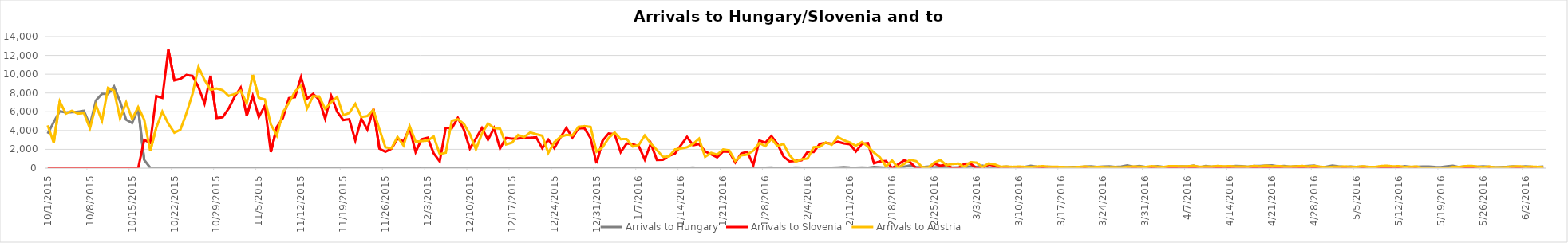
| Category | Arrivals to Hungary | Arrivals to Slovenia | Arrivals to Austria |
|---|---|---|---|
| 10/1/15 | 3667 | 0 | 4550 |
| 10/2/15 | 4897 | 0 | 2700 |
| 10/3/15 | 6056 | 0 | 7100 |
| 10/4/15 | 5925 | 0 | 5800 |
| 10/5/15 | 5952 | 0 | 6100 |
| 10/6/15 | 6000 | 0 | 5800 |
| 10/7/15 | 6103 | 0 | 5861 |
| 10/8/15 | 4583 | 6 | 4229 |
| 10/9/15 | 7215 | 0 | 6700 |
| 10/10/15 | 7907 | 0 | 5050 |
| 10/11/15 | 7897 | 0 | 8540 |
| 10/12/15 | 8702 | 0 | 8240 |
| 10/13/15 | 7081 | 0 | 5280 |
| 10/14/15 | 5157 | 0 | 7000 |
| 10/15/15 | 4808 | 0 | 5235 |
| 10/16/15 | 6353 | 0 | 6500 |
| 10/17/15 | 870 | 3000 | 5155 |
| 10/18/15 | 41 | 2700 | 1822 |
| 10/19/15 | 22 | 7677 | 4300 |
| 10/20/15 | 36 | 7478 | 6017 |
| 10/21/15 | 39 | 12616 | 4737 |
| 10/22/15 | 32 | 9339 | 3767 |
| 10/23/15 | 29 | 9500 | 4092 |
| 10/24/15 | 35 | 9925 | 5841 |
| 10/25/15 | 34 | 9818 | 7882 |
| 10/26/15 | 12 | 8625 | 10784 |
| 10/27/15 | 7 | 6877 | 9390 |
| 10/28/15 | 4 | 9848 | 8336 |
| 10/29/15 | 23 | 5341 | 8473 |
| 10/30/15 | 18 | 5409 | 8302 |
| 10/31/15 | 10 | 6344 | 7691 |
| 11/1/15 | 14 | 7611 | 7887 |
| 11/2/15 | 31 | 8568 | 8243 |
| 11/3/15 | 8 | 5591 | 6900 |
| 11/4/15 | 10 | 7693 | 9930 |
| 11/5/15 | 18 | 5426 | 7478 |
| 11/6/15 | 4 | 6655 | 7315 |
| 11/7/15 | 8 | 1716 | 4648 |
| 11/8/15 | 9 | 4381 | 3465 |
| 11/9/15 | 25 | 5341 | 5962 |
| 11/10/15 | 14 | 7457 | 6933 |
| 11/11/15 | 13 | 7554 | 8169 |
| 11/12/15 | 23 | 9681 | 8777 |
| 11/13/15 | 6 | 7397 | 6351 |
| 11/14/15 | 21 | 7905 | 7659 |
| 11/15/15 | 8 | 7300 | 7632 |
| 11/16/15 | 15 | 5261 | 6319 |
| 11/17/15 | 5 | 7704 | 7026 |
| 11/18/15 | 15 | 5998 | 7577 |
| 11/19/15 | 4 | 5119 | 5635 |
| 11/20/15 | 9 | 5211 | 5865 |
| 11/21/15 | 2 | 2952 | 6836 |
| 11/22/15 | 11 | 5260 | 5446 |
| 11/23/15 | 4 | 4102 | 5546 |
| 11/24/15 | 4 | 6297 | 6204 |
| 11/25/15 | 6 | 2070 | 4122 |
| 11/26/15 | 10 | 1742 | 2211 |
| 11/27/15 | 2 | 2065 | 2120 |
| 11/28/15 | 6 | 3139 | 3320 |
| 11/29/15 | 3 | 2843 | 2407 |
| 11/30/15 | 7 | 4274 | 4482 |
| 12/1/15 | 4 | 1709 | 2821 |
| 12/2/15 | 4 | 3077 | 2874 |
| 12/3/15 | 9 | 3237 | 2935 |
| 12/4/15 | 1 | 1577 | 3366 |
| 12/5/15 | 31 | 715 | 1493 |
| 12/6/15 | 7 | 4288 | 1643 |
| 12/7/15 | 0 | 4240 | 5035 |
| 12/8/15 | 13 | 5351 | 5210 |
| 12/9/15 | 14 | 4103 | 4714 |
| 12/10/15 | 3 | 2078 | 3623 |
| 12/11/15 | 0 | 3149 | 2000 |
| 12/12/15 | 13 | 4271 | 3675 |
| 12/13/15 | 10 | 3016 | 4754 |
| 12/14/15 | 3 | 4250 | 4263 |
| 12/15/15 | 2 | 2098 | 4193 |
| 12/16/15 | 6 | 3214 | 2519 |
| 12/17/15 | 0 | 3135 | 2717 |
| 12/18/15 | 11 | 3150 | 3532 |
| 12/19/15 | 31 | 3222 | 3305 |
| 12/20/15 | 8 | 3233 | 3800 |
| 12/21/15 | 25 | 3278 | 3611 |
| 12/22/15 | 1 | 2118 | 3451 |
| 12/23/15 | 21 | 3030 | 1613 |
| 12/24/15 | 8 | 2131 | 2764 |
| 12/25/15 | 2 | 3257 | 3321 |
| 12/26/15 | 17 | 4274 | 3532 |
| 12/27/15 | 10 | 3253 | 3476 |
| 12/28/15 | 0 | 4228 | 4394 |
| 12/29/15 | 0 | 4239 | 4468 |
| 12/30/15 | 11 | 3195 | 4386 |
| 12/31/15 | 5 | 511 | 1756 |
| 1/1/16 | 0 | 2914 | 2226 |
| 1/2/16 | 0 | 3690 | 3199 |
| 1/3/16 | 17 | 3619 | 3793 |
| 1/4/16 | 3 | 1708 | 3085 |
| 1/5/16 | 18 | 2626 | 3091 |
| 1/6/16 | 5 | 2550 | 2299 |
| 1/7/16 | 31 | 2337 | 2466 |
| 1/8/16 | 7 | 916 | 3472 |
| 1/9/16 | 15 | 2630 | 2619 |
| 1/10/16 | 6 | 880 | 1934 |
| 1/11/16 | 7 | 897 | 1204 |
| 1/12/16 | 2 | 1308 | 1231 |
| 1/13/16 | 5 | 1544 | 1991 |
| 1/14/16 | 4 | 2449 | 2082 |
| 1/15/16 | 14 | 3330 | 2219 |
| 1/16/16 | 65 | 2435 | 2578 |
| 1/17/16 | 11 | 2570 | 3141 |
| 1/18/16 | 9 | 1783 | 1203 |
| 1/19/16 | 29 | 1476 | 1630 |
| 1/20/16 | 10 | 1154 | 1439 |
| 1/21/16 | 13 | 1787 | 1989 |
| 1/22/16 | 47 | 1738 | 1885 |
| 1/23/16 | 10 | 606 | 777 |
| 1/24/16 | 15 | 1564 | 1366 |
| 1/25/16 | 5 | 1746 | 1450 |
| 1/26/16 | 4 | 326 | 1867 |
| 1/27/16 | 36 | 2935 | 2670 |
| 1/28/16 | 51 | 2719 | 2340 |
| 1/29/16 | 69 | 3416 | 3121 |
| 1/30/16 | 6 | 2556 | 2351 |
| 1/31/16 | 39 | 1249 | 2579 |
| 2/1/16 | 31 | 716 | 1367 |
| 2/2/16 | 69 | 765 | 690 |
| 2/3/16 | 46 | 841 | 937 |
| 2/4/16 | 31 | 1733 | 1026 |
| 2/5/16 | 19 | 1713 | 2235 |
| 2/6/16 | 49 | 2580 | 2252 |
| 2/7/16 | 53 | 2694 | 2737 |
| 2/8/16 | 48 | 2582 | 2490 |
| 2/9/16 | 72 | 2805 | 3314 |
| 2/10/16 | 104 | 2637 | 2968 |
| 2/11/16 | 54 | 2547 | 2731 |
| 2/12/16 | 39 | 1774 | 2378 |
| 2/13/16 | 66 | 2576 | 2781 |
| 2/14/16 | 51 | 2660 | 2301 |
| 2/15/16 | 119 | 516 | 1651 |
| 2/16/16 | 93 | 715 | 1143 |
| 2/17/16 | 34 | 769 | 181 |
| 2/18/16 | 73 | 0 | 817 |
| 2/19/16 | 113 | 407 | 50 |
| 2/20/16 | 151 | 828 | 453 |
| 2/21/16 | 288 | 623 | 899 |
| 2/22/16 | 103 | 0 | 744 |
| 2/23/16 | 112 | 0 | 111 |
| 2/24/16 | 166 | 0 | 75 |
| 2/25/16 | 76 | 478 | 583 |
| 2/26/16 | 140 | 254 | 874 |
| 2/27/16 | 111 | 382 | 321 |
| 2/28/16 | 62 | 0 | 447 |
| 2/29/16 | 78 | 0 | 487 |
| 3/1/16 | 83 | 466 | 118 |
| 3/2/16 | 181 | 479 | 644 |
| 3/3/16 | 133 | 0 | 588 |
| 3/4/16 | 268 | 0 | 114 |
| 3/5/16 | 89 | 409 | 500 |
| 3/6/16 | 72 | 253 | 402 |
| 3/7/16 | 100 | 0 | 153 |
| 3/8/16 | 167 | 0 | 171 |
| 3/9/16 | 73 | 0 | 134 |
| 3/10/16 | 70 | 0 | 172 |
| 3/11/16 | 133 | 0 | 132 |
| 3/12/16 | 245 | 0 | 116 |
| 3/13/16 | 148 | 0 | 171 |
| 3/14/16 | 123 | 0 | 211 |
| 3/15/16 | 153 | 0 | 147 |
| 3/16/16 | 104 | 0 | 150 |
| 3/17/16 | 102 | 0 | 129 |
| 3/18/16 | 95 | 0 | 107 |
| 3/19/16 | 132 | 0 | 109 |
| 3/20/16 | 107 | 0 | 126 |
| 3/21/16 | 176 | 0 | 177 |
| 3/22/16 | 188 | 0 | 103 |
| 3/23/16 | 137 | 0 | 127 |
| 3/24/16 | 171 | 0 | 121 |
| 3/25/16 | 199 | 0 | 94 |
| 3/26/16 | 125 | 0 | 104 |
| 3/27/16 | 171 | 6 | 78 |
| 3/28/16 | 293 | 0 | 144 |
| 3/29/16 | 154 | 5 | 170 |
| 3/30/16 | 234 | 4 | 152 |
| 3/31/16 | 127 | 0 | 120 |
| 4/1/16 | 142 | 0 | 210 |
| 4/2/16 | 217 | 0 | 156 |
| 4/3/16 | 119 | 0 | 122 |
| 4/4/16 | 99 | 0 | 221 |
| 4/5/16 | 176 | 2 | 203 |
| 4/6/16 | 191 | 0 | 198 |
| 4/7/16 | 178 | 0 | 196 |
| 4/8/16 | 280 | 0 | 254 |
| 4/9/16 | 83 | 0 | 138 |
| 4/10/16 | 230 | 0 | 171 |
| 4/11/16 | 149 | 0 | 171 |
| 4/12/16 | 214 | 0 | 232 |
| 4/13/16 | 150 | 0 | 193 |
| 4/14/16 | 161 | 0 | 209 |
| 4/15/16 | 237 | 0 | 176 |
| 4/16/16 | 210 | 0 | 175 |
| 4/17/16 | 144 | 0 | 148 |
| 4/18/16 | 229 | 0 | 231 |
| 4/19/16 | 235 | 0 | 183 |
| 4/20/16 | 274 | 0 | 268 |
| 4/21/16 | 294 | 0 | 195 |
| 4/22/16 | 195 | 0 | 227 |
| 4/23/16 | 226 | 0 | 174 |
| 4/24/16 | 151 | 0 | 175 |
| 4/25/16 | 202 | 0 | 191 |
| 4/26/16 | 190 | 0 | 230 |
| 4/27/16 | 241 | 0 | 172 |
| 4/28/16 | 284 | 0 | 232 |
| 4/29/16 | 108 | 0 | 151 |
| 4/30/16 | 141 | 0 | 102 |
| 5/1/16 | 274 | 0 | 136 |
| 5/2/16 | 187 | 0 | 150 |
| 5/3/16 | 131 | 0 | 173 |
| 5/4/16 | 169 | 0 | 141 |
| 5/5/16 | 133 | 0 | 128 |
| 5/6/16 | 178 | 0 | 201 |
| 5/7/16 | 132 | 0 | 129 |
| 5/8/16 | 75 | 0 | 121 |
| 5/9/16 | 124 | 0 | 218 |
| 5/10/16 | 128 | 0 | 260 |
| 5/11/16 | 120 | 0 | 191 |
| 5/12/16 | 89 | 0 | 210 |
| 5/13/16 | 201 | 0 | 120 |
| 5/14/16 | 120 | 0 | 150 |
| 5/15/16 | 139 | 0 | 169 |
| 5/16/16 | 169 | 0 | 0 |
| 5/17/16 | 164 | 0 | 0 |
| 5/18/16 | 121 | 0 | 0 |
| 5/19/16 | 100 | 0 | 0 |
| 5/20/16 | 198 | 0 | 0 |
| 5/21/16 | 245 | 0 | 138 |
| 5/22/16 | 108 | 0 | 122 |
| 5/23/16 | 193 | 0 | 210 |
| 5/24/16 | 198 | 0 | 245 |
| 5/25/16 | 139 | 0 | 156 |
| 5/26/16 | 181 | 0 | 107 |
| 5/27/16 | 144 | 0 | 170 |
| 5/28/16 | 92 | 0 | 79 |
| 5/29/16 | 115 | 0 | 77 |
| 5/30/16 | 140 | 0 | 122 |
| 5/31/16 | 182 | 0 | 177 |
| 6/1/16 | 138 | 0 | 196 |
| 6/2/16 | 187 | 0 | 132 |
| 6/3/16 | 146 | 0 | 167 |
| 6/4/16 | 135 | 0 | 135 |
| 6/5/16 | 164 | 0 | 107 |